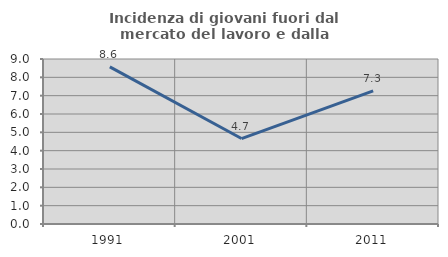
| Category | Incidenza di giovani fuori dal mercato del lavoro e dalla formazione  |
|---|---|
| 1991.0 | 8.569 |
| 2001.0 | 4.661 |
| 2011.0 | 7.264 |